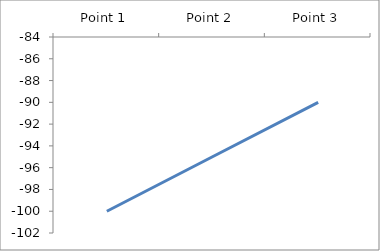
| Category | Series 6 |
|---|---|
| Point 1 | -100 |
| Point 2 | -95 |
| Point 3 | -90 |